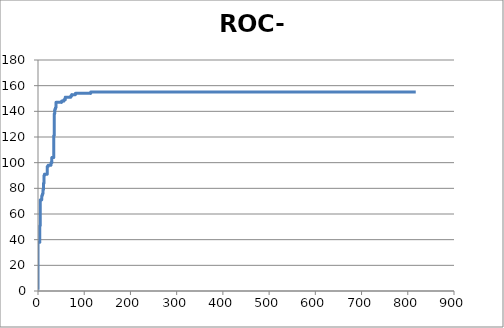
| Category | Series 0 |
|---|---|
| 0.0 | 1 |
| 0.0 | 2 |
| 0.0 | 3 |
| 0.0 | 4 |
| 0.0 | 5 |
| 0.0 | 6 |
| 0.0 | 7 |
| 0.0 | 8 |
| 0.0 | 9 |
| 0.0 | 10 |
| 0.0 | 11 |
| 0.0 | 12 |
| 0.0 | 13 |
| 0.0 | 14 |
| 0.0 | 15 |
| 0.0 | 16 |
| 0.0 | 17 |
| 0.0 | 18 |
| 0.0 | 19 |
| 0.0 | 20 |
| 0.0 | 21 |
| 0.0 | 22 |
| 0.0 | 23 |
| 0.0 | 24 |
| 0.0 | 25 |
| 0.0 | 26 |
| 0.0 | 27 |
| 0.0 | 28 |
| 0.0 | 29 |
| 0.0 | 30 |
| 0.0 | 31 |
| 0.0 | 32 |
| 0.0 | 33 |
| 0.0 | 34 |
| 0.0 | 35 |
| 0.0 | 36 |
| 0.0 | 37 |
| 0.0 | 38 |
| 1.0 | 38 |
| 2.0 | 38 |
| 3.0 | 38 |
| 4.0 | 38 |
| 4.0 | 39 |
| 4.0 | 40 |
| 4.0 | 41 |
| 4.0 | 42 |
| 4.0 | 43 |
| 4.0 | 44 |
| 4.0 | 45 |
| 4.0 | 46 |
| 4.0 | 47 |
| 4.0 | 48 |
| 4.0 | 49 |
| 4.0 | 50 |
| 4.0 | 51 |
| 5.0 | 51 |
| 5.0 | 52 |
| 5.0 | 53 |
| 5.0 | 54 |
| 5.0 | 55 |
| 5.0 | 56 |
| 5.0 | 57 |
| 5.0 | 58 |
| 5.0 | 59 |
| 5.0 | 60 |
| 5.0 | 61 |
| 5.0 | 62 |
| 5.0 | 63 |
| 5.0 | 64 |
| 5.0 | 65 |
| 5.0 | 66 |
| 5.0 | 67 |
| 5.0 | 68 |
| 5.0 | 69 |
| 5.0 | 70 |
| 5.0 | 71 |
| 6.0 | 71 |
| 7.0 | 71 |
| 8.0 | 71 |
| 8.0 | 72 |
| 8.0 | 73 |
| 8.0 | 74 |
| 9.0 | 74 |
| 9.0 | 75 |
| 10.0 | 75 |
| 10.0 | 76 |
| 11.0 | 76 |
| 11.0 | 77 |
| 11.0 | 78 |
| 11.0 | 79 |
| 12.0 | 79 |
| 12.0 | 80 |
| 12.0 | 81 |
| 12.0 | 82 |
| 12.0 | 83 |
| 12.0 | 84 |
| 13.0 | 84 |
| 13.0 | 85 |
| 13.0 | 86 |
| 13.0 | 87 |
| 13.0 | 88 |
| 13.0 | 89 |
| 13.0 | 90 |
| 14.0 | 90 |
| 14.0 | 91 |
| 15.0 | 91 |
| 16.0 | 91 |
| 17.0 | 91 |
| 18.0 | 91 |
| 19.0 | 91 |
| 20.0 | 91 |
| 20.0 | 92 |
| 20.0 | 93 |
| 20.0 | 94 |
| 20.0 | 95 |
| 20.0 | 96 |
| 20.0 | 97 |
| 21.0 | 97 |
| 22.0 | 97 |
| 22.0 | 98 |
| 23.0 | 98 |
| 24.0 | 98 |
| 25.0 | 98 |
| 26.0 | 98 |
| 27.0 | 98 |
| 28.0 | 98 |
| 28.0 | 99 |
| 28.0 | 100 |
| 29.0 | 100 |
| 30.0 | 100 |
| 30.0 | 101 |
| 30.0 | 102 |
| 30.0 | 103 |
| 30.0 | 104 |
| 31.0 | 104 |
| 32.0 | 104 |
| 33.0 | 104 |
| 34.0 | 104 |
| 34.0 | 105 |
| 34.0 | 106 |
| 34.0 | 107 |
| 34.0 | 108 |
| 34.0 | 109 |
| 34.0 | 110 |
| 34.0 | 111 |
| 34.0 | 112 |
| 34.0 | 113 |
| 34.0 | 114 |
| 34.0 | 115 |
| 34.0 | 116 |
| 34.0 | 117 |
| 34.0 | 118 |
| 34.0 | 119 |
| 34.0 | 120 |
| 34.0 | 121 |
| 35.0 | 121 |
| 35.0 | 122 |
| 35.0 | 123 |
| 35.0 | 124 |
| 35.0 | 125 |
| 35.0 | 126 |
| 35.0 | 127 |
| 35.0 | 128 |
| 35.0 | 129 |
| 35.0 | 130 |
| 35.0 | 131 |
| 35.0 | 132 |
| 35.0 | 133 |
| 35.0 | 134 |
| 35.0 | 135 |
| 35.0 | 136 |
| 35.0 | 137 |
| 35.0 | 138 |
| 36.0 | 138 |
| 36.0 | 139 |
| 36.0 | 140 |
| 36.0 | 141 |
| 37.0 | 141 |
| 37.0 | 142 |
| 38.0 | 142 |
| 38.0 | 143 |
| 39.0 | 143 |
| 39.0 | 144 |
| 39.0 | 145 |
| 39.0 | 146 |
| 39.0 | 147 |
| 40.0 | 147 |
| 41.0 | 147 |
| 42.0 | 147 |
| 43.0 | 147 |
| 44.0 | 147 |
| 45.0 | 147 |
| 46.0 | 147 |
| 47.0 | 147 |
| 48.0 | 147 |
| 49.0 | 147 |
| 50.0 | 147 |
| 51.0 | 147 |
| 51.0 | 148 |
| 52.0 | 148 |
| 53.0 | 148 |
| 54.0 | 148 |
| 55.0 | 148 |
| 56.0 | 148 |
| 56.0 | 149 |
| 57.0 | 149 |
| 58.0 | 149 |
| 59.0 | 149 |
| 59.0 | 150 |
| 59.0 | 151 |
| 60.0 | 151 |
| 61.0 | 151 |
| 62.0 | 151 |
| 63.0 | 151 |
| 64.0 | 151 |
| 65.0 | 151 |
| 66.0 | 151 |
| 67.0 | 151 |
| 68.0 | 151 |
| 69.0 | 151 |
| 70.0 | 151 |
| 71.0 | 151 |
| 71.0 | 152 |
| 72.0 | 152 |
| 73.0 | 152 |
| 73.0 | 153 |
| 74.0 | 153 |
| 75.0 | 153 |
| 76.0 | 153 |
| 77.0 | 153 |
| 78.0 | 153 |
| 79.0 | 153 |
| 80.0 | 153 |
| 81.0 | 153 |
| 81.0 | 154 |
| 82.0 | 154 |
| 83.0 | 154 |
| 84.0 | 154 |
| 85.0 | 154 |
| 86.0 | 154 |
| 87.0 | 154 |
| 88.0 | 154 |
| 89.0 | 154 |
| 90.0 | 154 |
| 91.0 | 154 |
| 92.0 | 154 |
| 93.0 | 154 |
| 94.0 | 154 |
| 95.0 | 154 |
| 96.0 | 154 |
| 97.0 | 154 |
| 98.0 | 154 |
| 99.0 | 154 |
| 100.0 | 154 |
| 101.0 | 154 |
| 102.0 | 154 |
| 103.0 | 154 |
| 104.0 | 154 |
| 105.0 | 154 |
| 106.0 | 154 |
| 107.0 | 154 |
| 108.0 | 154 |
| 109.0 | 154 |
| 110.0 | 154 |
| 111.0 | 154 |
| 112.0 | 154 |
| 113.0 | 154 |
| 114.0 | 154 |
| 114.0 | 155 |
| 115.0 | 155 |
| 116.0 | 155 |
| 117.0 | 155 |
| 118.0 | 155 |
| 119.0 | 155 |
| 120.0 | 155 |
| 121.0 | 155 |
| 122.0 | 155 |
| 123.0 | 155 |
| 124.0 | 155 |
| 125.0 | 155 |
| 126.0 | 155 |
| 127.0 | 155 |
| 128.0 | 155 |
| 129.0 | 155 |
| 130.0 | 155 |
| 131.0 | 155 |
| 132.0 | 155 |
| 133.0 | 155 |
| 134.0 | 155 |
| 135.0 | 155 |
| 136.0 | 155 |
| 137.0 | 155 |
| 138.0 | 155 |
| 139.0 | 155 |
| 140.0 | 155 |
| 141.0 | 155 |
| 142.0 | 155 |
| 143.0 | 155 |
| 144.0 | 155 |
| 145.0 | 155 |
| 146.0 | 155 |
| 147.0 | 155 |
| 148.0 | 155 |
| 149.0 | 155 |
| 150.0 | 155 |
| 151.0 | 155 |
| 152.0 | 155 |
| 153.0 | 155 |
| 154.0 | 155 |
| 155.0 | 155 |
| 156.0 | 155 |
| 157.0 | 155 |
| 158.0 | 155 |
| 159.0 | 155 |
| 160.0 | 155 |
| 161.0 | 155 |
| 162.0 | 155 |
| 163.0 | 155 |
| 164.0 | 155 |
| 165.0 | 155 |
| 166.0 | 155 |
| 167.0 | 155 |
| 168.0 | 155 |
| 169.0 | 155 |
| 170.0 | 155 |
| 171.0 | 155 |
| 172.0 | 155 |
| 173.0 | 155 |
| 174.0 | 155 |
| 175.0 | 155 |
| 176.0 | 155 |
| 177.0 | 155 |
| 178.0 | 155 |
| 179.0 | 155 |
| 180.0 | 155 |
| 181.0 | 155 |
| 182.0 | 155 |
| 183.0 | 155 |
| 184.0 | 155 |
| 185.0 | 155 |
| 186.0 | 155 |
| 187.0 | 155 |
| 188.0 | 155 |
| 189.0 | 155 |
| 190.0 | 155 |
| 191.0 | 155 |
| 192.0 | 155 |
| 193.0 | 155 |
| 194.0 | 155 |
| 195.0 | 155 |
| 196.0 | 155 |
| 197.0 | 155 |
| 198.0 | 155 |
| 199.0 | 155 |
| 200.0 | 155 |
| 201.0 | 155 |
| 202.0 | 155 |
| 203.0 | 155 |
| 204.0 | 155 |
| 205.0 | 155 |
| 206.0 | 155 |
| 207.0 | 155 |
| 208.0 | 155 |
| 209.0 | 155 |
| 210.0 | 155 |
| 211.0 | 155 |
| 212.0 | 155 |
| 213.0 | 155 |
| 214.0 | 155 |
| 215.0 | 155 |
| 216.0 | 155 |
| 217.0 | 155 |
| 218.0 | 155 |
| 219.0 | 155 |
| 220.0 | 155 |
| 221.0 | 155 |
| 222.0 | 155 |
| 223.0 | 155 |
| 224.0 | 155 |
| 225.0 | 155 |
| 226.0 | 155 |
| 227.0 | 155 |
| 228.0 | 155 |
| 229.0 | 155 |
| 230.0 | 155 |
| 231.0 | 155 |
| 232.0 | 155 |
| 233.0 | 155 |
| 234.0 | 155 |
| 235.0 | 155 |
| 236.0 | 155 |
| 237.0 | 155 |
| 238.0 | 155 |
| 239.0 | 155 |
| 240.0 | 155 |
| 241.0 | 155 |
| 242.0 | 155 |
| 243.0 | 155 |
| 244.0 | 155 |
| 245.0 | 155 |
| 246.0 | 155 |
| 247.0 | 155 |
| 248.0 | 155 |
| 249.0 | 155 |
| 250.0 | 155 |
| 251.0 | 155 |
| 252.0 | 155 |
| 253.0 | 155 |
| 254.0 | 155 |
| 255.0 | 155 |
| 256.0 | 155 |
| 257.0 | 155 |
| 258.0 | 155 |
| 259.0 | 155 |
| 260.0 | 155 |
| 261.0 | 155 |
| 262.0 | 155 |
| 263.0 | 155 |
| 264.0 | 155 |
| 265.0 | 155 |
| 266.0 | 155 |
| 267.0 | 155 |
| 268.0 | 155 |
| 269.0 | 155 |
| 270.0 | 155 |
| 271.0 | 155 |
| 272.0 | 155 |
| 273.0 | 155 |
| 274.0 | 155 |
| 275.0 | 155 |
| 276.0 | 155 |
| 277.0 | 155 |
| 278.0 | 155 |
| 279.0 | 155 |
| 280.0 | 155 |
| 281.0 | 155 |
| 282.0 | 155 |
| 283.0 | 155 |
| 284.0 | 155 |
| 285.0 | 155 |
| 286.0 | 155 |
| 287.0 | 155 |
| 288.0 | 155 |
| 289.0 | 155 |
| 290.0 | 155 |
| 291.0 | 155 |
| 292.0 | 155 |
| 293.0 | 155 |
| 294.0 | 155 |
| 295.0 | 155 |
| 296.0 | 155 |
| 297.0 | 155 |
| 298.0 | 155 |
| 299.0 | 155 |
| 300.0 | 155 |
| 301.0 | 155 |
| 302.0 | 155 |
| 303.0 | 155 |
| 304.0 | 155 |
| 305.0 | 155 |
| 306.0 | 155 |
| 307.0 | 155 |
| 308.0 | 155 |
| 309.0 | 155 |
| 310.0 | 155 |
| 311.0 | 155 |
| 312.0 | 155 |
| 313.0 | 155 |
| 314.0 | 155 |
| 315.0 | 155 |
| 316.0 | 155 |
| 317.0 | 155 |
| 318.0 | 155 |
| 319.0 | 155 |
| 320.0 | 155 |
| 321.0 | 155 |
| 322.0 | 155 |
| 323.0 | 155 |
| 324.0 | 155 |
| 325.0 | 155 |
| 326.0 | 155 |
| 327.0 | 155 |
| 328.0 | 155 |
| 329.0 | 155 |
| 330.0 | 155 |
| 331.0 | 155 |
| 332.0 | 155 |
| 333.0 | 155 |
| 334.0 | 155 |
| 335.0 | 155 |
| 336.0 | 155 |
| 337.0 | 155 |
| 338.0 | 155 |
| 339.0 | 155 |
| 340.0 | 155 |
| 341.0 | 155 |
| 342.0 | 155 |
| 343.0 | 155 |
| 344.0 | 155 |
| 345.0 | 155 |
| 346.0 | 155 |
| 347.0 | 155 |
| 348.0 | 155 |
| 349.0 | 155 |
| 350.0 | 155 |
| 351.0 | 155 |
| 352.0 | 155 |
| 353.0 | 155 |
| 354.0 | 155 |
| 355.0 | 155 |
| 356.0 | 155 |
| 357.0 | 155 |
| 358.0 | 155 |
| 359.0 | 155 |
| 360.0 | 155 |
| 361.0 | 155 |
| 362.0 | 155 |
| 363.0 | 155 |
| 364.0 | 155 |
| 365.0 | 155 |
| 366.0 | 155 |
| 367.0 | 155 |
| 368.0 | 155 |
| 369.0 | 155 |
| 370.0 | 155 |
| 371.0 | 155 |
| 372.0 | 155 |
| 373.0 | 155 |
| 374.0 | 155 |
| 375.0 | 155 |
| 376.0 | 155 |
| 377.0 | 155 |
| 378.0 | 155 |
| 379.0 | 155 |
| 380.0 | 155 |
| 381.0 | 155 |
| 382.0 | 155 |
| 383.0 | 155 |
| 384.0 | 155 |
| 385.0 | 155 |
| 386.0 | 155 |
| 387.0 | 155 |
| 388.0 | 155 |
| 389.0 | 155 |
| 390.0 | 155 |
| 391.0 | 155 |
| 392.0 | 155 |
| 393.0 | 155 |
| 394.0 | 155 |
| 395.0 | 155 |
| 396.0 | 155 |
| 397.0 | 155 |
| 398.0 | 155 |
| 399.0 | 155 |
| 400.0 | 155 |
| 401.0 | 155 |
| 402.0 | 155 |
| 403.0 | 155 |
| 404.0 | 155 |
| 405.0 | 155 |
| 406.0 | 155 |
| 407.0 | 155 |
| 408.0 | 155 |
| 409.0 | 155 |
| 410.0 | 155 |
| 411.0 | 155 |
| 412.0 | 155 |
| 413.0 | 155 |
| 414.0 | 155 |
| 415.0 | 155 |
| 416.0 | 155 |
| 417.0 | 155 |
| 418.0 | 155 |
| 419.0 | 155 |
| 420.0 | 155 |
| 421.0 | 155 |
| 422.0 | 155 |
| 423.0 | 155 |
| 424.0 | 155 |
| 425.0 | 155 |
| 426.0 | 155 |
| 427.0 | 155 |
| 428.0 | 155 |
| 429.0 | 155 |
| 430.0 | 155 |
| 431.0 | 155 |
| 432.0 | 155 |
| 433.0 | 155 |
| 434.0 | 155 |
| 435.0 | 155 |
| 436.0 | 155 |
| 437.0 | 155 |
| 438.0 | 155 |
| 439.0 | 155 |
| 440.0 | 155 |
| 441.0 | 155 |
| 442.0 | 155 |
| 443.0 | 155 |
| 444.0 | 155 |
| 445.0 | 155 |
| 446.0 | 155 |
| 447.0 | 155 |
| 448.0 | 155 |
| 449.0 | 155 |
| 450.0 | 155 |
| 451.0 | 155 |
| 452.0 | 155 |
| 453.0 | 155 |
| 454.0 | 155 |
| 455.0 | 155 |
| 456.0 | 155 |
| 457.0 | 155 |
| 458.0 | 155 |
| 459.0 | 155 |
| 460.0 | 155 |
| 461.0 | 155 |
| 462.0 | 155 |
| 463.0 | 155 |
| 464.0 | 155 |
| 465.0 | 155 |
| 466.0 | 155 |
| 467.0 | 155 |
| 468.0 | 155 |
| 469.0 | 155 |
| 470.0 | 155 |
| 471.0 | 155 |
| 472.0 | 155 |
| 473.0 | 155 |
| 474.0 | 155 |
| 475.0 | 155 |
| 476.0 | 155 |
| 477.0 | 155 |
| 478.0 | 155 |
| 479.0 | 155 |
| 480.0 | 155 |
| 481.0 | 155 |
| 482.0 | 155 |
| 483.0 | 155 |
| 484.0 | 155 |
| 485.0 | 155 |
| 486.0 | 155 |
| 487.0 | 155 |
| 488.0 | 155 |
| 489.0 | 155 |
| 490.0 | 155 |
| 491.0 | 155 |
| 492.0 | 155 |
| 493.0 | 155 |
| 494.0 | 155 |
| 495.0 | 155 |
| 496.0 | 155 |
| 497.0 | 155 |
| 498.0 | 155 |
| 499.0 | 155 |
| 500.0 | 155 |
| 501.0 | 155 |
| 502.0 | 155 |
| 503.0 | 155 |
| 504.0 | 155 |
| 505.0 | 155 |
| 506.0 | 155 |
| 507.0 | 155 |
| 508.0 | 155 |
| 509.0 | 155 |
| 510.0 | 155 |
| 511.0 | 155 |
| 512.0 | 155 |
| 513.0 | 155 |
| 514.0 | 155 |
| 515.0 | 155 |
| 516.0 | 155 |
| 517.0 | 155 |
| 518.0 | 155 |
| 519.0 | 155 |
| 520.0 | 155 |
| 521.0 | 155 |
| 522.0 | 155 |
| 523.0 | 155 |
| 524.0 | 155 |
| 525.0 | 155 |
| 526.0 | 155 |
| 527.0 | 155 |
| 528.0 | 155 |
| 529.0 | 155 |
| 530.0 | 155 |
| 531.0 | 155 |
| 532.0 | 155 |
| 533.0 | 155 |
| 534.0 | 155 |
| 535.0 | 155 |
| 536.0 | 155 |
| 537.0 | 155 |
| 538.0 | 155 |
| 539.0 | 155 |
| 540.0 | 155 |
| 541.0 | 155 |
| 542.0 | 155 |
| 543.0 | 155 |
| 544.0 | 155 |
| 545.0 | 155 |
| 546.0 | 155 |
| 547.0 | 155 |
| 548.0 | 155 |
| 549.0 | 155 |
| 550.0 | 155 |
| 551.0 | 155 |
| 552.0 | 155 |
| 553.0 | 155 |
| 554.0 | 155 |
| 555.0 | 155 |
| 556.0 | 155 |
| 557.0 | 155 |
| 558.0 | 155 |
| 559.0 | 155 |
| 560.0 | 155 |
| 561.0 | 155 |
| 562.0 | 155 |
| 563.0 | 155 |
| 564.0 | 155 |
| 565.0 | 155 |
| 566.0 | 155 |
| 567.0 | 155 |
| 568.0 | 155 |
| 569.0 | 155 |
| 570.0 | 155 |
| 571.0 | 155 |
| 572.0 | 155 |
| 573.0 | 155 |
| 574.0 | 155 |
| 575.0 | 155 |
| 576.0 | 155 |
| 577.0 | 155 |
| 578.0 | 155 |
| 579.0 | 155 |
| 580.0 | 155 |
| 581.0 | 155 |
| 582.0 | 155 |
| 583.0 | 155 |
| 584.0 | 155 |
| 585.0 | 155 |
| 586.0 | 155 |
| 587.0 | 155 |
| 588.0 | 155 |
| 589.0 | 155 |
| 590.0 | 155 |
| 591.0 | 155 |
| 592.0 | 155 |
| 593.0 | 155 |
| 594.0 | 155 |
| 595.0 | 155 |
| 596.0 | 155 |
| 597.0 | 155 |
| 598.0 | 155 |
| 599.0 | 155 |
| 600.0 | 155 |
| 601.0 | 155 |
| 602.0 | 155 |
| 603.0 | 155 |
| 604.0 | 155 |
| 605.0 | 155 |
| 606.0 | 155 |
| 607.0 | 155 |
| 608.0 | 155 |
| 609.0 | 155 |
| 610.0 | 155 |
| 611.0 | 155 |
| 612.0 | 155 |
| 613.0 | 155 |
| 614.0 | 155 |
| 615.0 | 155 |
| 616.0 | 155 |
| 617.0 | 155 |
| 618.0 | 155 |
| 619.0 | 155 |
| 620.0 | 155 |
| 621.0 | 155 |
| 622.0 | 155 |
| 623.0 | 155 |
| 624.0 | 155 |
| 625.0 | 155 |
| 626.0 | 155 |
| 627.0 | 155 |
| 628.0 | 155 |
| 629.0 | 155 |
| 630.0 | 155 |
| 631.0 | 155 |
| 632.0 | 155 |
| 633.0 | 155 |
| 634.0 | 155 |
| 635.0 | 155 |
| 636.0 | 155 |
| 637.0 | 155 |
| 638.0 | 155 |
| 639.0 | 155 |
| 640.0 | 155 |
| 641.0 | 155 |
| 642.0 | 155 |
| 643.0 | 155 |
| 644.0 | 155 |
| 645.0 | 155 |
| 646.0 | 155 |
| 647.0 | 155 |
| 648.0 | 155 |
| 649.0 | 155 |
| 650.0 | 155 |
| 651.0 | 155 |
| 652.0 | 155 |
| 653.0 | 155 |
| 654.0 | 155 |
| 655.0 | 155 |
| 656.0 | 155 |
| 657.0 | 155 |
| 658.0 | 155 |
| 659.0 | 155 |
| 660.0 | 155 |
| 661.0 | 155 |
| 662.0 | 155 |
| 663.0 | 155 |
| 664.0 | 155 |
| 665.0 | 155 |
| 666.0 | 155 |
| 667.0 | 155 |
| 668.0 | 155 |
| 669.0 | 155 |
| 670.0 | 155 |
| 671.0 | 155 |
| 672.0 | 155 |
| 673.0 | 155 |
| 674.0 | 155 |
| 675.0 | 155 |
| 676.0 | 155 |
| 677.0 | 155 |
| 678.0 | 155 |
| 679.0 | 155 |
| 680.0 | 155 |
| 681.0 | 155 |
| 682.0 | 155 |
| 683.0 | 155 |
| 684.0 | 155 |
| 685.0 | 155 |
| 686.0 | 155 |
| 687.0 | 155 |
| 688.0 | 155 |
| 689.0 | 155 |
| 690.0 | 155 |
| 691.0 | 155 |
| 692.0 | 155 |
| 693.0 | 155 |
| 694.0 | 155 |
| 695.0 | 155 |
| 696.0 | 155 |
| 697.0 | 155 |
| 698.0 | 155 |
| 699.0 | 155 |
| 700.0 | 155 |
| 701.0 | 155 |
| 702.0 | 155 |
| 703.0 | 155 |
| 704.0 | 155 |
| 705.0 | 155 |
| 706.0 | 155 |
| 707.0 | 155 |
| 708.0 | 155 |
| 709.0 | 155 |
| 710.0 | 155 |
| 711.0 | 155 |
| 712.0 | 155 |
| 713.0 | 155 |
| 714.0 | 155 |
| 715.0 | 155 |
| 716.0 | 155 |
| 717.0 | 155 |
| 718.0 | 155 |
| 719.0 | 155 |
| 720.0 | 155 |
| 721.0 | 155 |
| 722.0 | 155 |
| 723.0 | 155 |
| 724.0 | 155 |
| 725.0 | 155 |
| 726.0 | 155 |
| 727.0 | 155 |
| 728.0 | 155 |
| 729.0 | 155 |
| 730.0 | 155 |
| 731.0 | 155 |
| 732.0 | 155 |
| 733.0 | 155 |
| 734.0 | 155 |
| 735.0 | 155 |
| 736.0 | 155 |
| 737.0 | 155 |
| 738.0 | 155 |
| 739.0 | 155 |
| 740.0 | 155 |
| 741.0 | 155 |
| 742.0 | 155 |
| 743.0 | 155 |
| 744.0 | 155 |
| 745.0 | 155 |
| 746.0 | 155 |
| 747.0 | 155 |
| 748.0 | 155 |
| 749.0 | 155 |
| 750.0 | 155 |
| 751.0 | 155 |
| 752.0 | 155 |
| 753.0 | 155 |
| 754.0 | 155 |
| 755.0 | 155 |
| 756.0 | 155 |
| 757.0 | 155 |
| 758.0 | 155 |
| 759.0 | 155 |
| 760.0 | 155 |
| 761.0 | 155 |
| 762.0 | 155 |
| 763.0 | 155 |
| 764.0 | 155 |
| 765.0 | 155 |
| 766.0 | 155 |
| 767.0 | 155 |
| 768.0 | 155 |
| 769.0 | 155 |
| 770.0 | 155 |
| 771.0 | 155 |
| 772.0 | 155 |
| 773.0 | 155 |
| 774.0 | 155 |
| 775.0 | 155 |
| 776.0 | 155 |
| 777.0 | 155 |
| 778.0 | 155 |
| 779.0 | 155 |
| 780.0 | 155 |
| 781.0 | 155 |
| 782.0 | 155 |
| 783.0 | 155 |
| 784.0 | 155 |
| 785.0 | 155 |
| 786.0 | 155 |
| 787.0 | 155 |
| 788.0 | 155 |
| 789.0 | 155 |
| 790.0 | 155 |
| 791.0 | 155 |
| 792.0 | 155 |
| 793.0 | 155 |
| 794.0 | 155 |
| 795.0 | 155 |
| 796.0 | 155 |
| 797.0 | 155 |
| 798.0 | 155 |
| 799.0 | 155 |
| 800.0 | 155 |
| 801.0 | 155 |
| 802.0 | 155 |
| 803.0 | 155 |
| 804.0 | 155 |
| 805.0 | 155 |
| 806.0 | 155 |
| 807.0 | 155 |
| 808.0 | 155 |
| 809.0 | 155 |
| 810.0 | 155 |
| 811.0 | 155 |
| 812.0 | 155 |
| 813.0 | 155 |
| 814.0 | 155 |
| 815.0 | 155 |
| 816.0 | 155 |
| 817.0 | 155 |